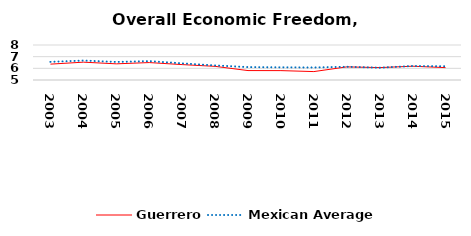
| Category | Guerrero | Mexican Average  |
|---|---|---|
| 2003.0 | 6.36 | 6.552 |
| 2004.0 | 6.528 | 6.668 |
| 2005.0 | 6.385 | 6.546 |
| 2006.0 | 6.494 | 6.619 |
| 2007.0 | 6.32 | 6.428 |
| 2008.0 | 6.171 | 6.248 |
| 2009.0 | 5.808 | 6.106 |
| 2010.0 | 5.804 | 6.086 |
| 2011.0 | 5.722 | 6.074 |
| 2012.0 | 6.124 | 6.134 |
| 2013.0 | 6.063 | 6.054 |
| 2014.0 | 6.182 | 6.2 |
| 2015.0 | 6.061 | 6.174 |